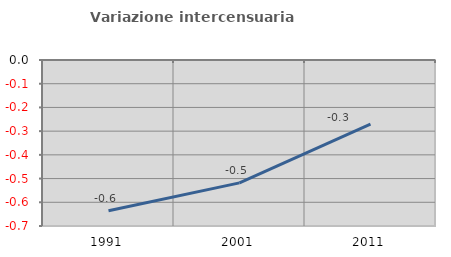
| Category | Variazione intercensuaria annua |
|---|---|
| 1991.0 | -0.635 |
| 2001.0 | -0.518 |
| 2011.0 | -0.27 |